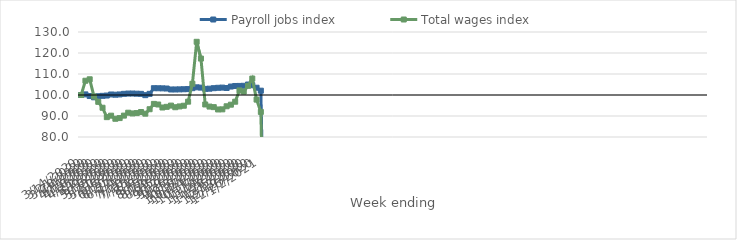
| Category | Payroll jobs index | Total wages index |
|---|---|---|
| 14/03/2020 | 100 | 100 |
| 21/03/2020 | 100.29 | 106.789 |
| 28/03/2020 | 99.504 | 107.478 |
| 04/04/2020 | 98.903 | 99.33 |
| 11/04/2020 | 99.409 | 96.746 |
| 18/04/2020 | 99.602 | 93.929 |
| 25/04/2020 | 99.743 | 89.454 |
| 02/05/2020 | 100.252 | 90.149 |
| 09/05/2020 | 100.14 | 88.679 |
| 16/05/2020 | 100.264 | 89.008 |
| 23/05/2020 | 100.553 | 90.184 |
| 30/05/2020 | 100.688 | 91.566 |
| 06/06/2020 | 100.698 | 91.219 |
| 13/06/2020 | 100.622 | 91.389 |
| 20/06/2020 | 100.548 | 91.894 |
| 27/06/2020 | 99.921 | 91.113 |
| 04/07/2020 | 100.555 | 93.222 |
| 11/07/2020 | 103.242 | 95.764 |
| 18/07/2020 | 103.209 | 95.473 |
| 25/07/2020 | 103.168 | 94.042 |
| 01/08/2020 | 103.082 | 94.366 |
| 08/08/2020 | 102.631 | 94.953 |
| 15/08/2020 | 102.635 | 94.176 |
| 22/08/2020 | 102.683 | 94.554 |
| 29/08/2020 | 102.744 | 94.892 |
| 05/09/2020 | 102.816 | 96.828 |
| 12/09/2020 | 103.258 | 105.356 |
| 19/09/2020 | 103.655 | 125.33 |
| 26/09/2020 | 103.519 | 117.351 |
| 03/10/2020 | 102.921 | 95.487 |
| 10/10/2020 | 103.009 | 94.491 |
| 17/10/2020 | 103.25 | 94.223 |
| 24/10/2020 | 103.436 | 93.114 |
| 31/10/2020 | 103.523 | 93.163 |
| 07/11/2020 | 103.329 | 94.63 |
| 14/11/2020 | 104.028 | 95.391 |
| 21/11/2020 | 104.288 | 96.802 |
| 28/11/2020 | 104.323 | 102.175 |
| 05/12/2020 | 104.388 | 101.619 |
| 12/12/2020 | 104.988 | 104.372 |
| 19/12/2020 | 104.666 | 107.826 |
| 26/12/2020 | 103.462 | 97.805 |
| 02/01/2021 | 102.056 | 91.94 |